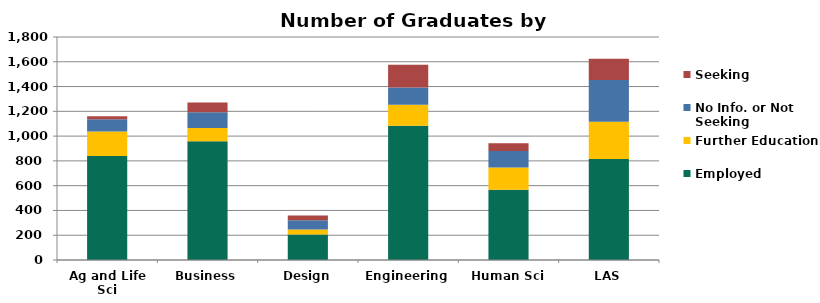
| Category | Employed | Further Education | No Info. or Not Seeking | Seeking |
|---|---|---|---|---|
| Ag and Life Sci | 840 | 198 | 98 | 24 |
| Business | 959 | 107 | 126 | 80 |
| Design | 205 | 42 | 74 | 39 |
| Engineering | 1083 | 171 | 138 | 184 |
| Human Sci | 567 | 179 | 134 | 63 |
| LAS | 816 | 299 | 338 | 171 |